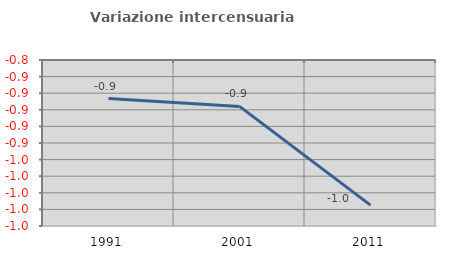
| Category | Variazione intercensuaria annua |
|---|---|
| 1991.0 | -0.886 |
| 2001.0 | -0.896 |
| 2011.0 | -1.015 |